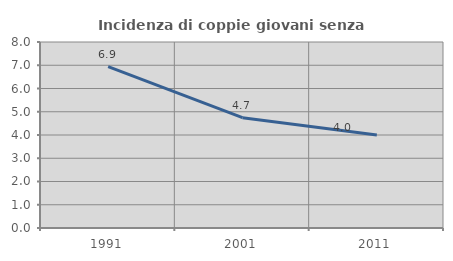
| Category | Incidenza di coppie giovani senza figli |
|---|---|
| 1991.0 | 6.94 |
| 2001.0 | 4.743 |
| 2011.0 | 4.003 |